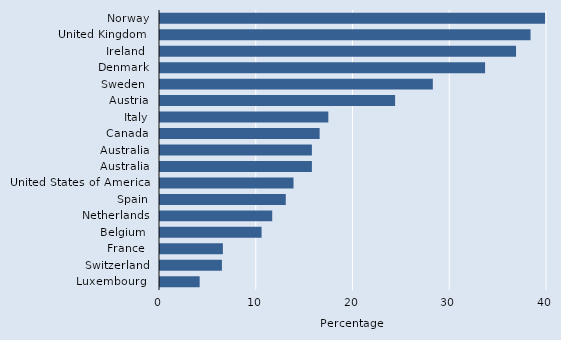
| Category | Series 0 |
|---|---|
| Norway | 39.8 |
| United Kingdom  | 38.3 |
| Ireland  | 36.8 |
| Denmark | 33.6 |
| Sweden  | 28.2 |
| Austria | 24.3 |
| Italy | 17.4 |
| Canada | 16.5 |
| Australia | 15.7 |
| Australia | 15.7 |
| United States of America  | 13.8 |
| Spain | 13 |
| Netherlands | 11.6 |
| Belgium  | 10.5 |
| France  | 6.5 |
| Switzerland | 6.4 |
| Luxembourg  | 4.1 |